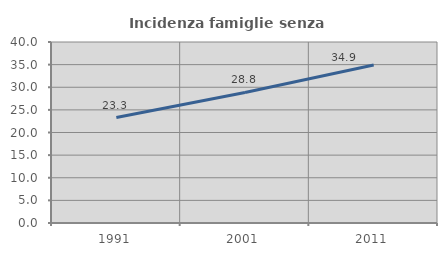
| Category | Incidenza famiglie senza nuclei |
|---|---|
| 1991.0 | 23.297 |
| 2001.0 | 28.845 |
| 2011.0 | 34.926 |